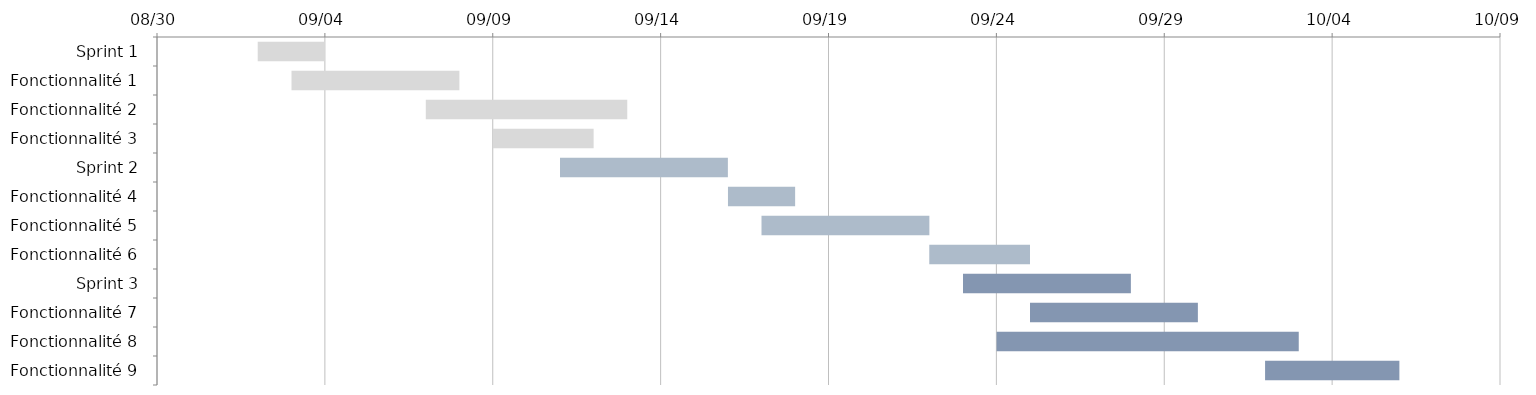
| Category | DÉBUT | JOURS |
|---|---|---|
| Sprint 1 | 2022-09-02 | 2 |
| Fonctionnalité 1 | 2022-09-03 | 5 |
| Fonctionnalité 2 | 2022-09-07 | 6 |
| Fonctionnalité 3 | 2022-09-09 | 3 |
| Sprint 2 | 2022-09-11 | 5 |
| Fonctionnalité 4 | 2022-09-16 | 2 |
| Fonctionnalité 5 | 2022-09-17 | 5 |
| Fonctionnalité 6 | 2022-09-22 | 3 |
| Sprint 3 | 2022-09-23 | 5 |
| Fonctionnalité 7 | 2022-09-25 | 5 |
| Fonctionnalité 8 | 2022-09-24 | 9 |
| Fonctionnalité 9 | 2022-10-02 | 4 |